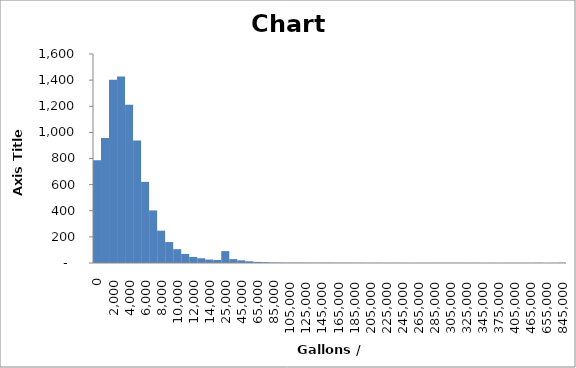
| Category | Series 0 |
|---|---|
| 0.0 | 786.321 |
| 1000.0 | 956.035 |
| 2000.0 | 1402.928 |
| 3000.0 | 1427.91 |
| 4000.0 | 1210.771 |
| 5000.0 | 937.524 |
| 6000.0 | 621.03 |
| 7000.0 | 402.498 |
| 8000.0 | 247.445 |
| 9000.0 | 160.213 |
| 10000.0 | 105.744 |
| 11000.0 | 69.376 |
| 12000.0 | 46.36 |
| 13000.0 | 36.204 |
| 14000.0 | 26.456 |
| 15000.0 | 23.098 |
| 25000.0 | 91 |
| 35000.0 | 29.651 |
| 45000.0 | 20.313 |
| 55000.0 | 13.105 |
| 65000.0 | 8.355 |
| 75000.0 | 6.225 |
| 85000.0 | 3.358 |
| 95000.0 | 2.703 |
| 105000.0 | 2.212 |
| 115000.0 | 2.212 |
| 125000.0 | 1.884 |
| 135000.0 | 1.474 |
| 145000.0 | 1.802 |
| 155000.0 | 1.638 |
| 165000.0 | 0.983 |
| 175000.0 | 1.065 |
| 185000.0 | 0.983 |
| 195000.0 | 0.819 |
| 205000.0 | 0.41 |
| 215000.0 | 0.819 |
| 225000.0 | 0.328 |
| 235000.0 | 0.41 |
| 245000.0 | 0.41 |
| 255000.0 | 0.328 |
| 265000.0 | 0.164 |
| 275000.0 | 0.328 |
| 285000.0 | 0.655 |
| 295000.0 | 0.41 |
| 305000.0 | 0.41 |
| 315000.0 | 0.573 |
| 325000.0 | 0.246 |
| 335000.0 | 0.573 |
| 345000.0 | 0.328 |
| 355000.0 | 0 |
| 375000.0 | 0.328 |
| 385000.0 | 0.164 |
| 405000.0 | 0.246 |
| 425000.0 | 0.082 |
| 465000.0 | 0.41 |
| 625000.0 | 1.065 |
| 655000.0 | 0.164 |
| 715000.0 | 0.655 |
| 845000.0 | 1.802 |